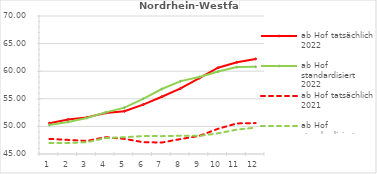
| Category | ab Hof tatsächlich 2022 | ab Hof standardisiert 2022 | ab Hof tatsächlich 2021 | ab Hof standardisiert 2021 |
|---|---|---|---|---|
| 0 | 50.585 | 50.256 | 47.736 | 46.988 |
| 1 | 51.235 | 50.807 | 47.555 | 46.993 |
| 2 | 51.633 | 51.52 | 47.366 | 47.141 |
| 3 | 52.432 | 52.538 | 48.053 | 47.894 |
| 4 | 52.761 | 53.403 | 47.743 | 48.041 |
| 5 | 53.952 | 55.002 | 47.145 | 48.251 |
| 6 | 55.378 | 56.775 | 47.079 | 48.236 |
| 7 | 56.89 | 58.202 | 47.714 | 48.303 |
| 8 | 58.75 | 58.95 | 48.282 | 48.282 |
| 9 | 60.629 | 59.93 | 49.576 | 48.745 |
| 10 | 61.607 | 60.744 | 50.539 | 49.424 |
| 11 | 62.221 | 60.798 | 50.597 | 49.778 |